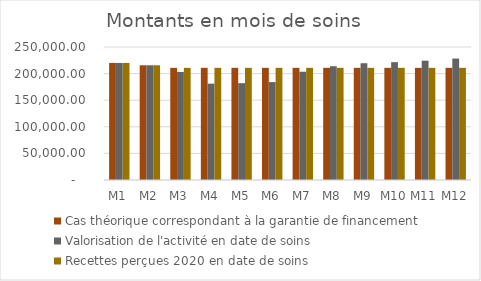
| Category | Cas théorique correspondant à la garantie de financement  | Valorisation de l'activité en date de soins | Recettes perçues 2020 en date de soins |
|---|---|---|---|
| M1 | 220023.07 | 220023.07 | 220023.07 |
| M2 | 215645.96 | 215645.96 | 215645.96 |
| M3 | 210837.5 | 203111.7 | 210837.5 |
| M4 | 210837.5 | 181091.19 | 210837.5 |
| M5 | 210837.5 | 182011.6 | 210837.5 |
| M6 | 210837.5 | 184058.45 | 210837.5 |
| M7 | 210837.5 | 203487.48 | 210837.5 |
| M8 | 210837.5 | 213859.12 | 210837.5 |
| M9 | 210837.5 | 219528.87 | 210837.5 |
| M10 | 210837.5 | 221533.55 | 210837.5 |
| M11 | 210837.5 | 224260.19 | 210837.5 |
| M12 | 210837.5 | 228304.55 | 210837.5 |